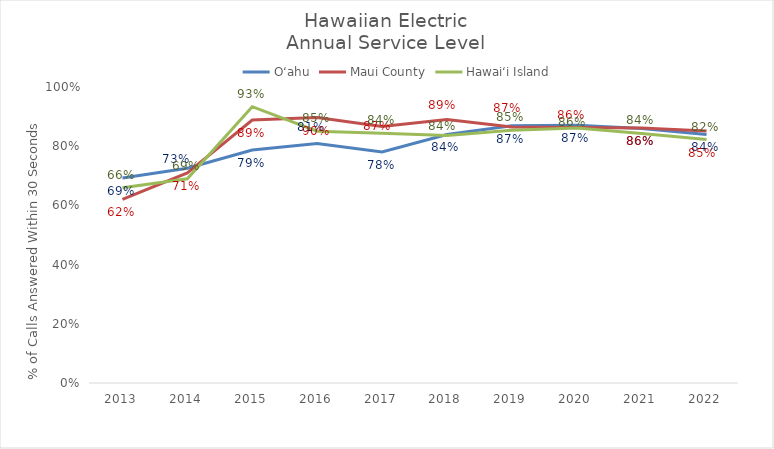
| Category | O‘ahu | Maui County | Hawai‘i Island |
|---|---|---|---|
| 2013.0 | 0.693 | 0.62 | 0.66 |
| 2014.0 | 0.726 | 0.71 | 0.69 |
| 2015.0 | 0.787 | 0.888 | 0.933 |
| 2016.0 | 0.809 | 0.897 | 0.851 |
| 2017.0 | 0.78 | 0.867 | 0.844 |
| 2018.0 | 0.84 | 0.89 | 0.836 |
| 2019.0 | 0.869 | 0.865 | 0.854 |
| 2020.0 | 0.871 | 0.863 | 0.861 |
| 2021.0 | 0.86 | 0.861 | 0.843 |
| 2022.0 | 0.84 | 0.851 | 0.822 |